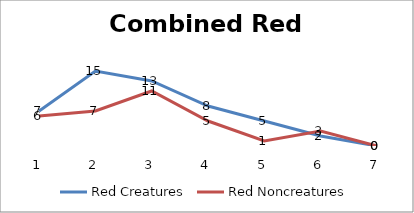
| Category | Red Creatures | Red Noncreatures |
|---|---|---|
| 0 | 7 | 6 |
| 1 | 15 | 7 |
| 2 | 13 | 11 |
| 3 | 8 | 5 |
| 4 | 5 | 1 |
| 5 | 2 | 3 |
| 6 | 0 | 0 |